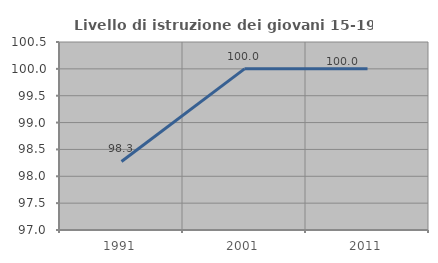
| Category | Livello di istruzione dei giovani 15-19 anni |
|---|---|
| 1991.0 | 98.276 |
| 2001.0 | 100 |
| 2011.0 | 100 |